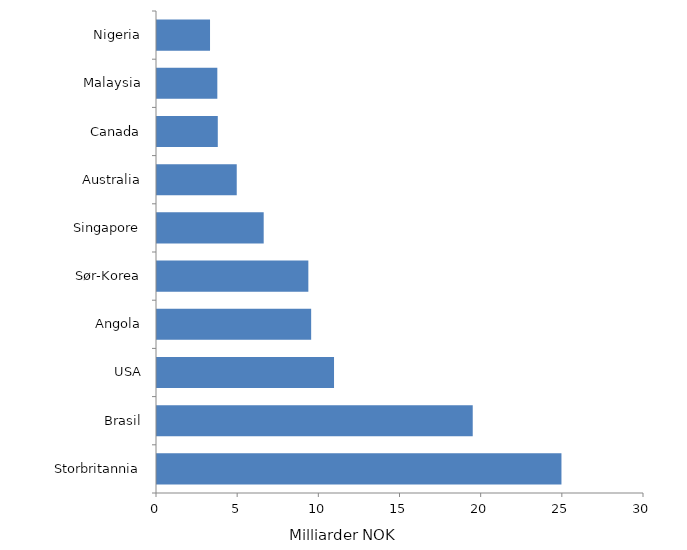
| Category | Omsetning |
|---|---|
| Storbritannia | 24.915 |
| Brasil | 19.449 |
| USA | 10.905 |
| Angola | 9.496 |
| Sør-Korea | 9.323 |
| Singapore | 6.572 |
| Australia | 4.912 |
| Canada | 3.745 |
| Malaysia | 3.716 |
| Nigeria | 3.267 |